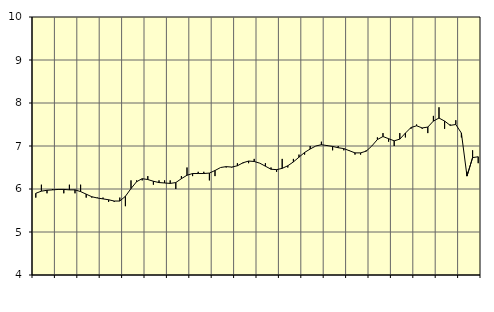
| Category | Piggar | Personliga och kulturella tjänster, SNI 90-98 |
|---|---|---|
| nan | 5.8 | 5.9 |
| 1.0 | 6.1 | 5.95 |
| 1.0 | 5.9 | 5.97 |
| 1.0 | 6 | 5.98 |
| nan | 6 | 5.99 |
| 2.0 | 5.9 | 5.99 |
| 2.0 | 6.1 | 5.98 |
| 2.0 | 5.9 | 5.98 |
| nan | 6.1 | 5.94 |
| 3.0 | 5.8 | 5.88 |
| 3.0 | 5.8 | 5.82 |
| 3.0 | 5.8 | 5.79 |
| nan | 5.8 | 5.77 |
| 4.0 | 5.7 | 5.75 |
| 4.0 | 5.7 | 5.72 |
| 4.0 | 5.8 | 5.72 |
| nan | 5.6 | 5.83 |
| 5.0 | 6.2 | 6.01 |
| 5.0 | 6.2 | 6.17 |
| 5.0 | 6.2 | 6.24 |
| nan | 6.3 | 6.22 |
| 6.0 | 6.1 | 6.18 |
| 6.0 | 6.2 | 6.15 |
| 6.0 | 6.2 | 6.14 |
| nan | 6.2 | 6.13 |
| 7.0 | 6 | 6.15 |
| 7.0 | 6.3 | 6.24 |
| 7.0 | 6.5 | 6.32 |
| nan | 6.3 | 6.36 |
| 8.0 | 6.4 | 6.36 |
| 8.0 | 6.4 | 6.36 |
| 8.0 | 6.2 | 6.37 |
| nan | 6.3 | 6.43 |
| 9.0 | 6.5 | 6.5 |
| 9.0 | 6.5 | 6.52 |
| 9.0 | 6.5 | 6.51 |
| nan | 6.6 | 6.54 |
| 10.0 | 6.6 | 6.61 |
| 10.0 | 6.6 | 6.65 |
| 10.0 | 6.7 | 6.64 |
| nan | 6.6 | 6.6 |
| 11.0 | 6.6 | 6.53 |
| 11.0 | 6.5 | 6.46 |
| 11.0 | 6.4 | 6.45 |
| nan | 6.7 | 6.48 |
| 12.0 | 6.5 | 6.54 |
| 12.0 | 6.7 | 6.63 |
| 12.0 | 6.8 | 6.74 |
| nan | 6.8 | 6.85 |
| 13.0 | 7 | 6.93 |
| 13.0 | 7 | 7 |
| 13.0 | 7.1 | 7.03 |
| nan | 7 | 7.01 |
| 14.0 | 6.9 | 6.99 |
| 14.0 | 7 | 6.96 |
| 14.0 | 6.9 | 6.94 |
| nan | 6.9 | 6.89 |
| 15.0 | 6.8 | 6.84 |
| 15.0 | 6.8 | 6.84 |
| 15.0 | 6.9 | 6.88 |
| nan | 7 | 7 |
| 16.0 | 7.2 | 7.15 |
| 16.0 | 7.3 | 7.22 |
| 16.0 | 7.1 | 7.17 |
| nan | 7 | 7.12 |
| 17.0 | 7.3 | 7.16 |
| 17.0 | 7.2 | 7.3 |
| 17.0 | 7.4 | 7.43 |
| nan | 7.5 | 7.47 |
| 18.0 | 7.4 | 7.42 |
| 18.0 | 7.3 | 7.44 |
| 18.0 | 7.7 | 7.58 |
| nan | 7.9 | 7.65 |
| 19.0 | 7.4 | 7.58 |
| 19.0 | 7.5 | 7.48 |
| 19.0 | 7.6 | 7.5 |
| nan | 7.2 | 7.3 |
| 20.0 | 6.4 | 6.3 |
| 20.0 | 6.9 | 6.73 |
| 20.0 | 6.6 | 6.75 |